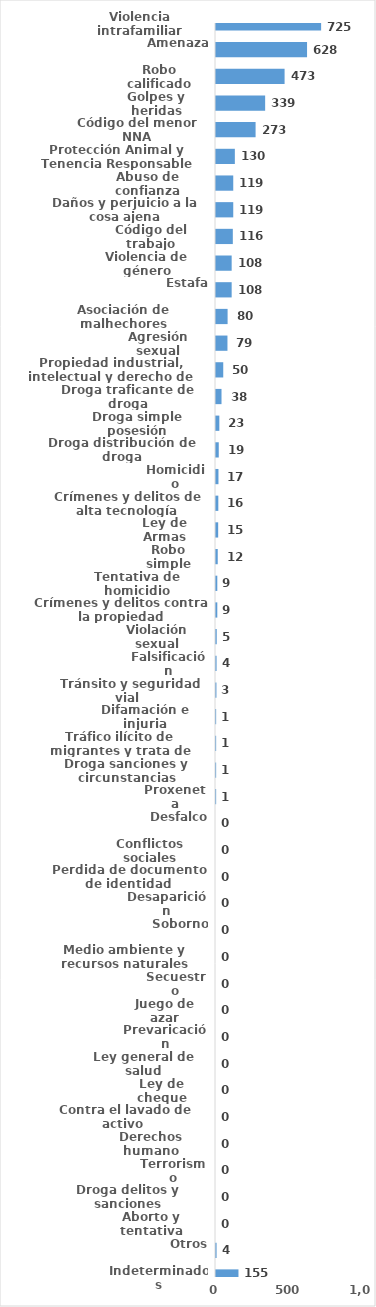
| Category | Series 0 |
|---|---|
| Violencia intrafamiliar | 725 |
| Amenaza | 628 |
| Robo calificado | 473 |
| Golpes y heridas | 339 |
| Código del menor NNA | 273 |
| Protección Animal y Tenencia Responsable | 130 |
| Abuso de confianza | 119 |
| Daños y perjuicio a la cosa ajena | 119 |
| Código del trabajo | 116 |
| Violencia de género | 108 |
| Estafa | 108 |
| Asociación de malhechores | 80 |
| Agresión sexual | 79 |
| Propiedad industrial, intelectual y derecho de autor | 50 |
| Droga traficante de droga | 38 |
| Droga simple posesión | 23 |
| Droga distribución de droga | 19 |
| Homicidio | 17 |
| Crímenes y delitos de alta tecnología | 16 |
| Ley de Armas | 15 |
| Robo simple | 12 |
| Tentativa de homicidio | 9 |
| Crímenes y delitos contra la propiedad | 9 |
| Violación sexual | 5 |
| Falsificación | 4 |
| Tránsito y seguridad vial  | 3 |
| Difamación e injuria | 1 |
| Tráfico ilícito de migrantes y trata de personas | 1 |
| Droga sanciones y circunstancias agravantes | 1 |
| Proxeneta | 1 |
| Desfalco | 0 |
| Conflictos sociales | 0 |
| Perdida de documento de identidad | 0 |
| Desaparición | 0 |
| Soborno | 0 |
| Medio ambiente y recursos naturales | 0 |
| Secuestro | 0 |
| Juego de azar | 0 |
| Prevaricación | 0 |
| Ley general de salud | 0 |
| Ley de cheque | 0 |
| Contra el lavado de activo  | 0 |
| Derechos humano | 0 |
| Terrorismo | 0 |
| Droga delitos y sanciones | 0 |
| Aborto y tentativa | 0 |
| Otros | 4 |
| Indeterminados | 155 |